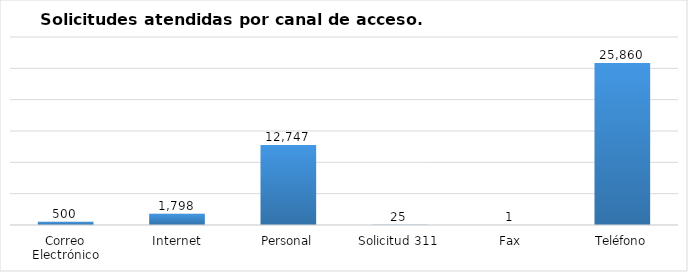
| Category | Total |
|---|---|
| Correo Electrónico | 500 |
| Internet | 1798 |
| Personal | 12747 |
| Solicitud 311 | 25 |
| Fax | 1 |
| Teléfono | 25860 |